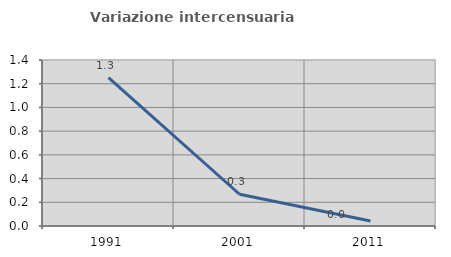
| Category | Variazione intercensuaria annua |
|---|---|
| 1991.0 | 1.252 |
| 2001.0 | 0.268 |
| 2011.0 | 0.042 |